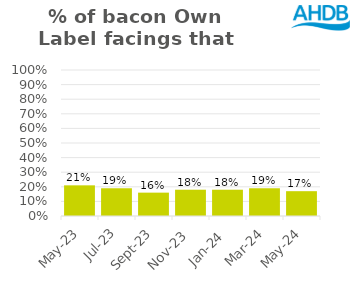
| Category | Bacon |
|---|---|
| 2023-05-01 | 0.21 |
| 2023-07-01 | 0.19 |
| 2023-09-01 | 0.16 |
| 2023-11-01 | 0.18 |
| 2024-01-01 | 0.18 |
| 2024-03-01 | 0.19 |
| 2024-05-01 | 0.17 |